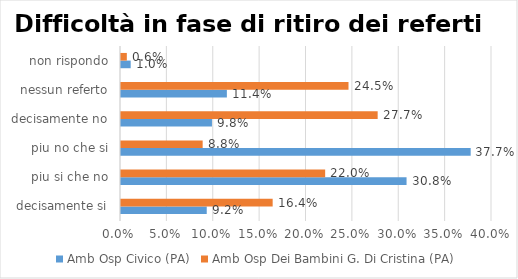
| Category | Amb Osp Civico (PA) | Amb Osp Dei Bambini G. Di Cristina (PA) |
|---|---|---|
| decisamente si | 0.092 | 0.164 |
| piu si che no | 0.308 | 0.22 |
| piu no che si | 0.377 | 0.088 |
| decisamente no | 0.098 | 0.277 |
| nessun referto | 0.114 | 0.245 |
| non rispondo | 0.01 | 0.006 |